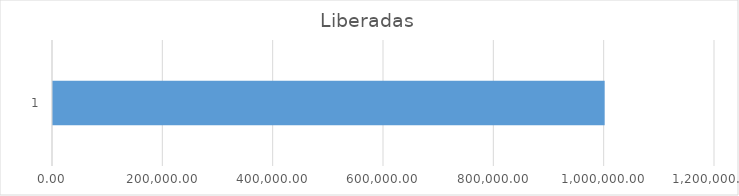
| Category | Secretaria Municipal de Segurança Urbana  |
|---|---|
| 0 | 1000000 |